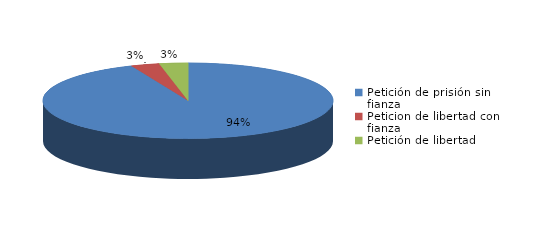
| Category | Series 0 |
|---|---|
| Petición de prisión sin fianza | 88 |
| Peticion de libertad con fianza | 3 |
| Petición de libertad | 3 |